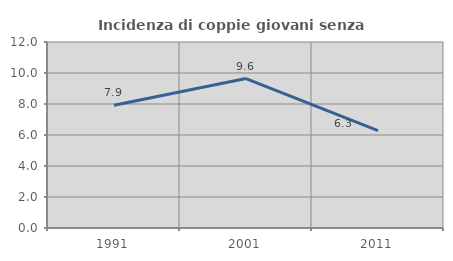
| Category | Incidenza di coppie giovani senza figli |
|---|---|
| 1991.0 | 7.916 |
| 2001.0 | 9.64 |
| 2011.0 | 6.276 |